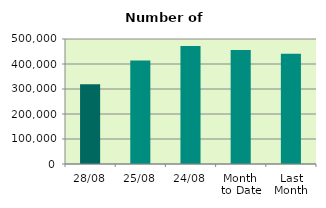
| Category | Series 0 |
|---|---|
| 28/08 | 318870 |
| 25/08 | 414106 |
| 24/08 | 471814 |
| Month 
to Date | 456288 |
| Last
Month | 440756.667 |